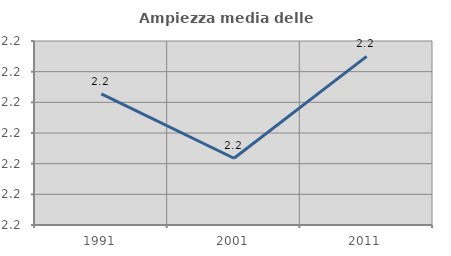
| Category | Ampiezza media delle famiglie |
|---|---|
| 1991.0 | 2.216 |
| 2001.0 | 2.206 |
| 2011.0 | 2.222 |